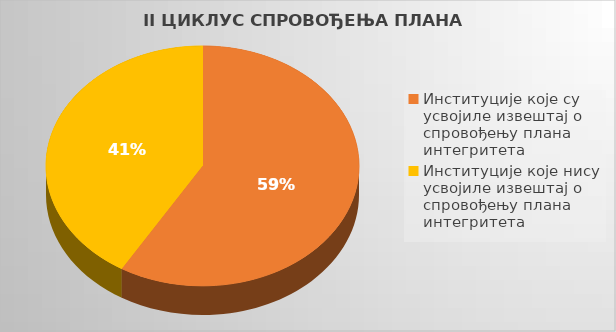
| Category | Series 0 |
|---|---|
| Институције које су усвојиле извештај о спровођењу плана интегритета | 0.586 |
| Институције које нису усвојиле извештај о спровођењу плана интегритета | 0.414 |